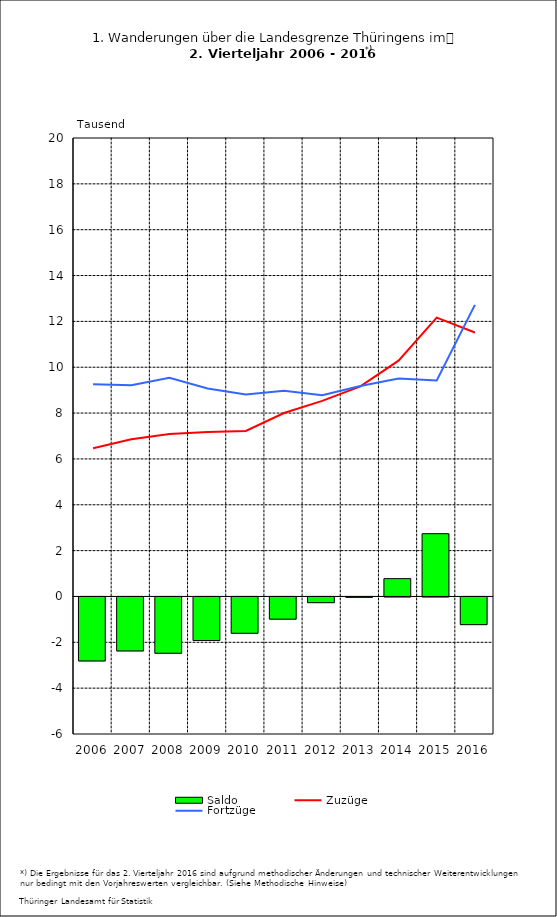
| Category | Saldo |
|---|---|
| 2006.0 | -2.792 |
| 2007.0 | -2.354 |
| 2008.0 | -2.456 |
| 2009.0 | -1.9 |
| 2010.0 | -1.585 |
| 2011.0 | -0.968 |
| 2012.0 | -0.249 |
| 2013.0 | -0.016 |
| 2014.0 | 0.777 |
| 2015.0 | 2.738 |
| 2016.0 | -1.207 |